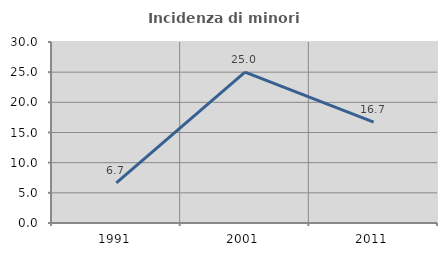
| Category | Incidenza di minori stranieri |
|---|---|
| 1991.0 | 6.667 |
| 2001.0 | 25 |
| 2011.0 | 16.72 |